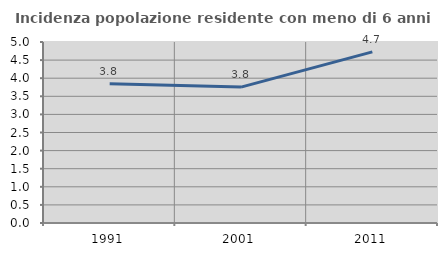
| Category | Incidenza popolazione residente con meno di 6 anni |
|---|---|
| 1991.0 | 3.849 |
| 2001.0 | 3.754 |
| 2011.0 | 4.726 |